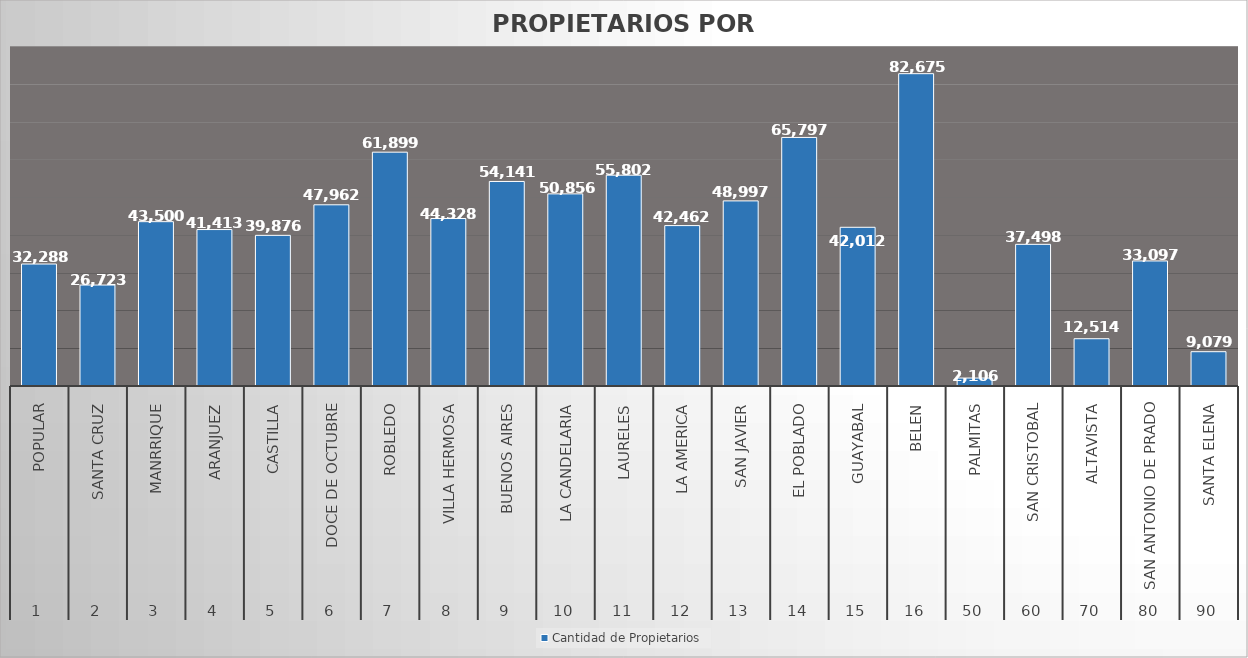
| Category | Cantidad de Propietarios |
|---|---|
| 0 | 32288 |
| 1 | 26723 |
| 2 | 43500 |
| 3 | 41413 |
| 4 | 39876 |
| 5 | 47962 |
| 6 | 61899 |
| 7 | 44328 |
| 8 | 54141 |
| 9 | 50856 |
| 10 | 55802 |
| 11 | 42462 |
| 12 | 48997 |
| 13 | 65797 |
| 14 | 42012 |
| 15 | 82675 |
| 16 | 2106 |
| 17 | 37498 |
| 18 | 12514 |
| 19 | 33097 |
| 20 | 9079 |